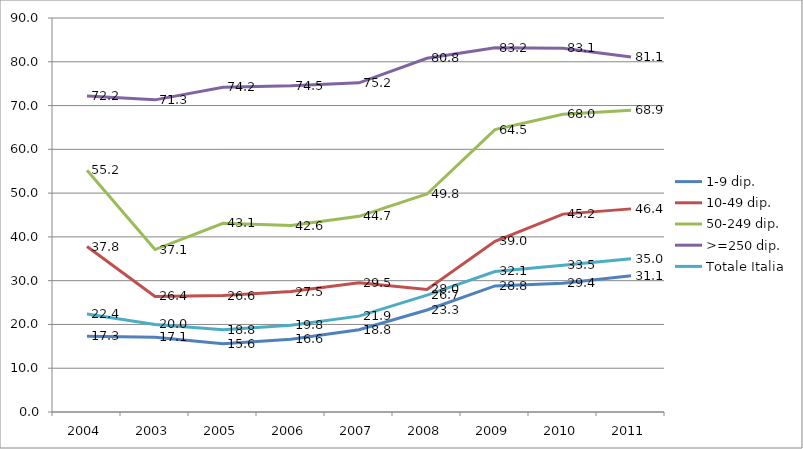
| Category | 1-9 dip. | 10-49 dip. | 50-249 dip. | >=250 dip. | Totale Italia |
|---|---|---|---|---|---|
| 2004.0 | 17.3 | 37.8 | 55.2 | 72.2 | 22.4 |
| 2003.0 | 17.1 | 26.4 | 37.1 | 71.3 | 20 |
| 2005.0 | 15.6 | 26.6 | 43.1 | 74.2 | 18.8 |
| 2006.0 | 16.6 | 27.5 | 42.6 | 74.5 | 19.8 |
| 2007.0 | 18.8 | 29.5 | 44.7 | 75.2 | 21.9 |
| 2008.0 | 23.3 | 28 | 49.8 | 80.8 | 26.7 |
| 2009.0 | 28.8 | 39 | 64.5 | 83.2 | 32.1 |
| 2010.0 | 29.4 | 45.2 | 68 | 83.1 | 33.5 |
| 2011.0 | 31.1 | 46.4 | 68.9 | 81.1 | 35 |